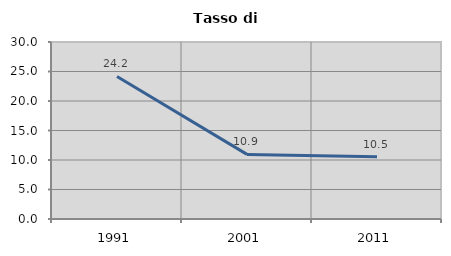
| Category | Tasso di disoccupazione   |
|---|---|
| 1991.0 | 24.155 |
| 2001.0 | 10.949 |
| 2011.0 | 10.535 |